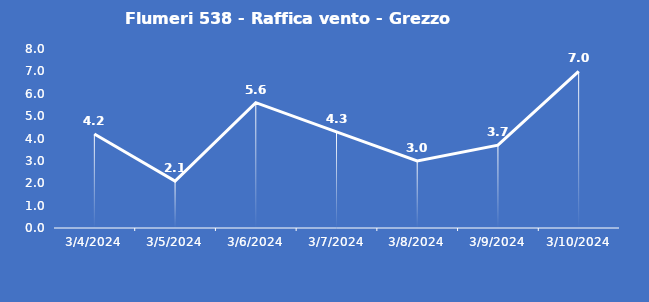
| Category | Flumeri 538 - Raffica vento - Grezzo (m/s) |
|---|---|
| 3/4/24 | 4.2 |
| 3/5/24 | 2.1 |
| 3/6/24 | 5.6 |
| 3/7/24 | 4.3 |
| 3/8/24 | 3 |
| 3/9/24 | 3.7 |
| 3/10/24 | 7 |